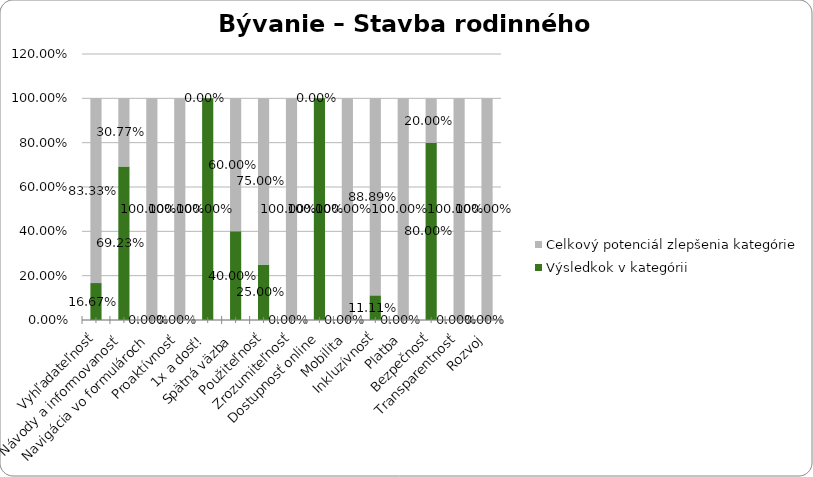
| Category | Výsledkok v kategórii | Celkový potenciál zlepšenia kategórie |
|---|---|---|
| Vyhľadateľnosť | 0.167 | 0.833 |
| Návody a informovanosť | 0.692 | 0.308 |
| Navigácia vo formulároch | 0 | 1 |
| Proaktívnosť | 0 | 1 |
| 1x a dosť! | 1 | 0 |
| Spätná väzba | 0.4 | 0.6 |
| Použiteľnosť | 0.25 | 0.75 |
| Zrozumiteľnosť | 0 | 1 |
| Dostupnosť online | 1 | 0 |
| Mobilita | 0 | 1 |
| Inkluzívnosť | 0.111 | 0.889 |
| Platba | 0 | 1 |
| Bezpečnosť | 0.8 | 0.2 |
| Transparentnosť | 0 | 1 |
| Rozvoj | 0 | 1 |